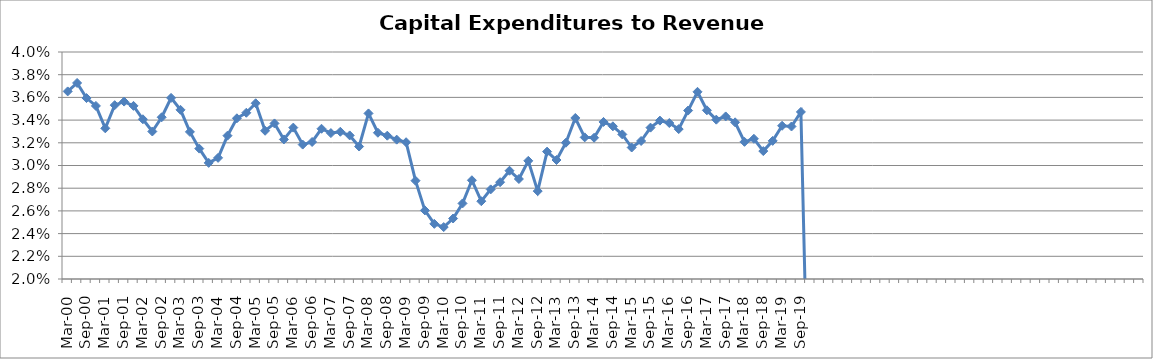
| Category | Series 0 |
|---|---|
| Mar-00 | 0.037 |
| Jun-00 | 0.037 |
| Sep-00 | 0.036 |
| Dec-00 | 0.035 |
| Mar-01 | 0.033 |
| Jun-01 | 0.035 |
| Sep-01 | 0.036 |
| Dec-01 | 0.035 |
| Mar-02 | 0.034 |
| Jun-02 | 0.033 |
| Sep-02 | 0.034 |
| Dec-02 | 0.036 |
| Mar-03 | 0.035 |
| Jun-03 | 0.033 |
| Sep-03 | 0.031 |
| Dec-03 | 0.03 |
| Mar-04 | 0.031 |
| Jun-04 | 0.033 |
| Sep-04 | 0.034 |
| Dec-04 | 0.035 |
| Mar-05 | 0.035 |
| Jun-05 | 0.033 |
| Sep-05 | 0.034 |
| Dec-05 | 0.032 |
| Mar-06 | 0.033 |
| Jun-06 | 0.032 |
| Sep-06 | 0.032 |
| Dec-06 | 0.033 |
| Mar-07 | 0.033 |
| Jun-07 | 0.033 |
| Sep-07 | 0.033 |
| Dec-07 | 0.032 |
| Mar-08 | 0.035 |
| Jun-08 | 0.033 |
| Sep-08 | 0.033 |
| Dec-08 | 0.032 |
| Mar-09 | 0.032 |
| Jun-09 | 0.029 |
| Sep-09 | 0.026 |
| Dec-09 | 0.025 |
| Mar-10 | 0.025 |
| Jun-10 | 0.025 |
| Sep-10 | 0.027 |
| Dec-10 | 0.029 |
| Mar-11 | 0.027 |
| Jun-11 | 0.028 |
| Sep-11 | 0.029 |
| Dec-11 | 0.03 |
| Mar-12 | 0.029 |
| Jun-12 | 0.03 |
| Sep-12 | 0.028 |
| Dec-12 | 0.031 |
| Mar-13 | 0.03 |
| Jun-13 | 0.032 |
| Sep-13 | 0.034 |
| Dec-13 | 0.032 |
| Mar-14 | 0.032 |
| Jun-14 | 0.034 |
| Sep-14 | 0.033 |
| Dec-14 | 0.033 |
| Mar-15 | 0.032 |
| Jun-15 | 0.032 |
| Sep-15 | 0.033 |
| Dec-15 | 0.034 |
| Mar-16 | 0.034 |
| Jun-16 | 0.033 |
| Sep-16 | 0.035 |
| Dec-16 | 0.036 |
| Mar-17 | 0.035 |
| Jun-17 | 0.034 |
| Sep-17 | 0.034 |
| Dec-17 | 0.034 |
| Mar-18 | 0.032 |
| Jun-18 | 0.032 |
| Sep-18 | 0.031 |
| Dec-18 | 0.032 |
| Mar-19 | 0.034 |
| Jun-19 | 0.033 |
| Sep-19 | 0.035 |